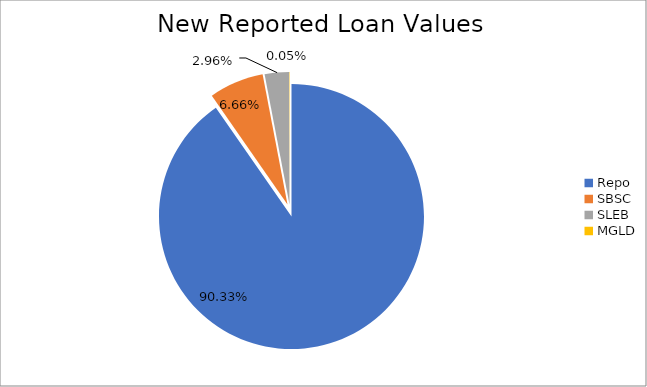
| Category | Series 0 |
|---|---|
| Repo | 12320584.305 |
| SBSC | 908610.751 |
| SLEB | 404249.319 |
| MGLD | 6552.825 |